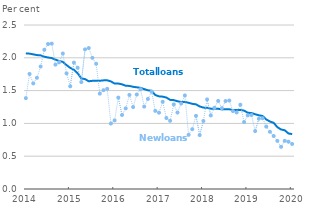
| Category | Total loans | New loans |
|---|---|---|
| 2014-01-01 | 2.068 | 1.385 |
| 2014-02-01 | 2.063 | 1.754 |
| 2014-03-01 | 2.053 | 1.609 |
| 2014-04-01 | 2.042 | 1.695 |
| 2014-05-01 | 2.037 | 1.867 |
| 2014-06-01 | 2.017 | 2.122 |
| 2014-07-01 | 2.004 | 2.21 |
| 2014-08-01 | 1.996 | 2.216 |
| 2014-09-01 | 1.972 | 1.896 |
| 2014-10-01 | 1.951 | 1.932 |
| 2014-11-01 | 1.938 | 2.065 |
| 2014-12-01 | 1.889 | 1.762 |
| 2015-01-01 | 1.846 | 1.566 |
| 2015-02-01 | 1.818 | 1.927 |
| 2015-03-01 | 1.764 | 1.848 |
| 2015-04-01 | 1.686 | 1.63 |
| 2015-05-01 | 1.676 | 2.129 |
| 2015-06-01 | 1.642 | 2.149 |
| 2015-07-01 | 1.649 | 1.999 |
| 2015-08-01 | 1.651 | 1.909 |
| 2015-09-01 | 1.65 | 1.453 |
| 2015-10-01 | 1.656 | 1.507 |
| 2015-11-01 | 1.657 | 1.527 |
| 2015-12-01 | 1.64 | 0.998 |
| 2016-01-01 | 1.607 | 1.046 |
| 2016-02-01 | 1.607 | 1.393 |
| 2016-03-01 | 1.596 | 1.128 |
| 2016-04-01 | 1.574 | 1.229 |
| 2016-05-01 | 1.571 | 1.434 |
| 2016-06-01 | 1.558 | 1.249 |
| 2016-07-01 | 1.55 | 1.44 |
| 2016-08-01 | 1.543 | 1.522 |
| 2016-09-01 | 1.523 | 1.256 |
| 2016-10-01 | 1.505 | 1.373 |
| 2016-11-01 | 1.497 | 1.482 |
| 2016-12-01 | 1.433 | 1.191 |
| 2017-01-01 | 1.412 | 1.164 |
| 2017-02-01 | 1.408 | 1.329 |
| 2017-03-01 | 1.394 | 1.083 |
| 2017-04-01 | 1.359 | 1.039 |
| 2017-05-01 | 1.355 | 1.29 |
| 2017-06-01 | 1.338 | 1.166 |
| 2017-07-01 | 1.326 | 1.303 |
| 2017-08-01 | 1.328 | 1.426 |
| 2017-09-01 | 1.314 | 0.825 |
| 2017-10-01 | 1.298 | 0.912 |
| 2017-11-01 | 1.29 | 1.115 |
| 2017-12-01 | 1.259 | 0.822 |
| 2018-01-01 | 1.241 | 1.037 |
| 2018-02-01 | 1.239 | 1.366 |
| 2018-03-01 | 1.224 | 1.121 |
| 2018-04-01 | 1.224 | 1.238 |
| 2018-05-01 | 1.223 | 1.342 |
| 2018-06-01 | 1.213 | 1.232 |
| 2018-07-01 | 1.215 | 1.341 |
| 2018-08-01 | 1.215 | 1.349 |
| 2018-09-01 | 1.204 | 1.187 |
| 2018-10-01 | 1.204 | 1.167 |
| 2018-11-01 | 1.205 | 1.284 |
| 2018-12-01 | 1.195 | 1.021 |
| 2019-01-01 | 1.163 | 1.123 |
| 2019-02-01 | 1.158 | 1.128 |
| 2019-03-01 | 1.14 | 0.883 |
| 2019-04-01 | 1.123 | 1.071 |
| 2019-05-01 | 1.113 | 1.079 |
| 2019-06-01 | 1.06 | 0.952 |
| 2019-07-01 | 1.029 | 0.872 |
| 2019-08-01 | 1.008 | 0.808 |
| 2019-09-01 | 0.943 | 0.733 |
| 2019-10-01 | 0.907 | 0.643 |
| 2019-11-01 | 0.895 | 0.735 |
| 2019-12-01 | 0.846 | 0.721 |
| 2020-01-01 | 0.837 | 0.686 |